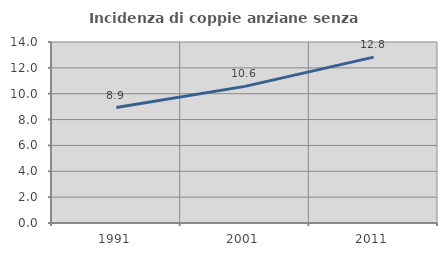
| Category | Incidenza di coppie anziane senza figli  |
|---|---|
| 1991.0 | 8.934 |
| 2001.0 | 10.569 |
| 2011.0 | 12.832 |